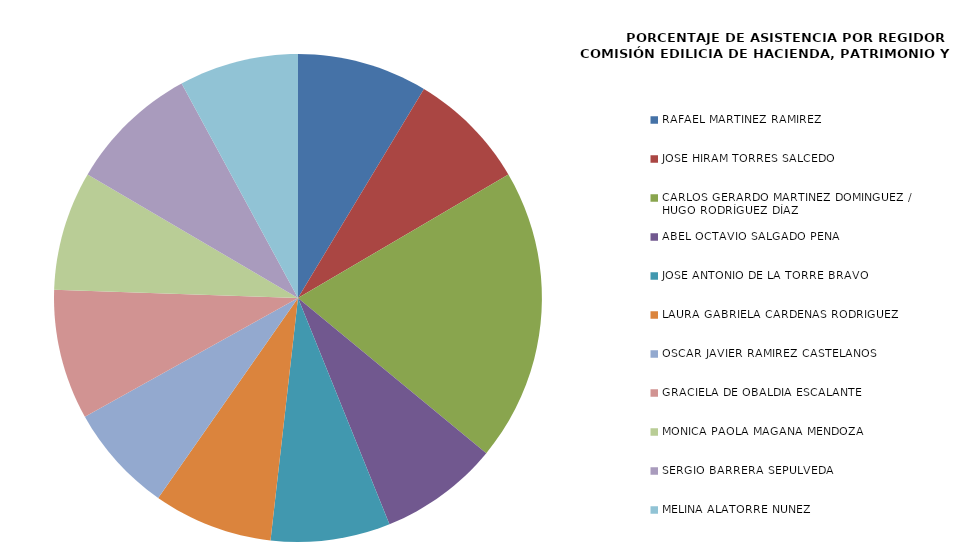
| Category | Series 0 |
|---|---|
| RAFAEL MARTÍNEZ RAMÍREZ | 100 |
| JOSÉ HIRAM TORRES SALCEDO | 91.667 |
| CARLOS GERARDO MARTÍNEZ DOMÍNGUEZ / 
HUGO RODRÍGUEZ DÍAZ | 225 |
| ABEL OCTAVIO SALGADO PEÑA  | 91.667 |
| JOSÉ ANTONIO DE LA TORRE BRAVO | 91.667 |
| LAURA GABRIELA CÁRDENAS RODRIGUEZ | 91.667 |
| OSCAR JAVIER RAMÍREZ CASTELANOS | 83.333 |
| GRACIELA DE OBALDÍA ESCALANTE | 100 |
| MÓNICA PAOLA MAGAÑA MENDOZA | 91.667 |
| SERGIO BARRERA SEPÚLVEDA | 100 |
| MELINA ALATORRE NÚÑEZ | 91.667 |